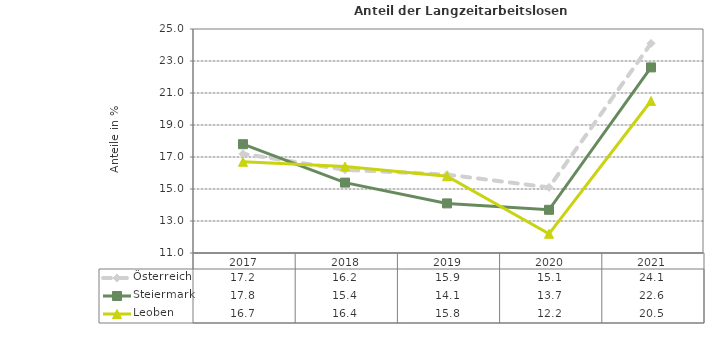
| Category | Österreich | Steiermark | Leoben |
|---|---|---|---|
| 2021.0 | 24.1 | 22.6 | 20.5 |
| 2020.0 | 15.1 | 13.7 | 12.2 |
| 2019.0 | 15.9 | 14.1 | 15.8 |
| 2018.0 | 16.2 | 15.4 | 16.4 |
| 2017.0 | 17.2 | 17.8 | 16.7 |